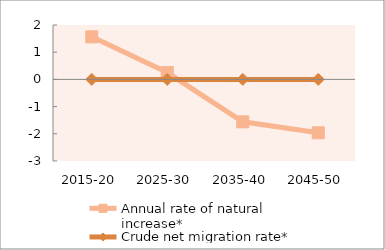
| Category | Annual rate of natural increase* | Crude net migration rate* |
|---|---|---|
| 2015-20 | 1.564 | 0 |
| 2025-30 | 0.252 | 0 |
| 2035-40 | -1.56 | 0 |
| 2045-50 | -1.964 | 0 |